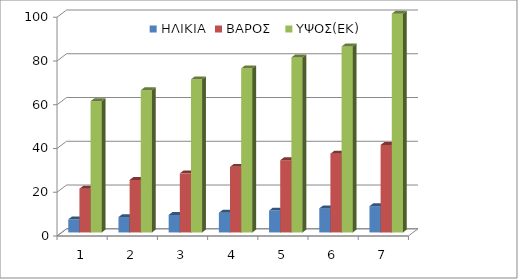
| Category | ΗΛΙΚΙΑ | ΒΑΡΟΣ  | ΥΨΟΣ(ΕΚ) |
|---|---|---|---|
| 0 | 6 | 20 | 60 |
| 1 | 7 | 24 | 65 |
| 2 | 8 | 27 | 70 |
| 3 | 9 | 30 | 75 |
| 4 | 10 | 33 | 80 |
| 5 | 11 | 36 | 85 |
| 6 | 12 | 40 | 100 |